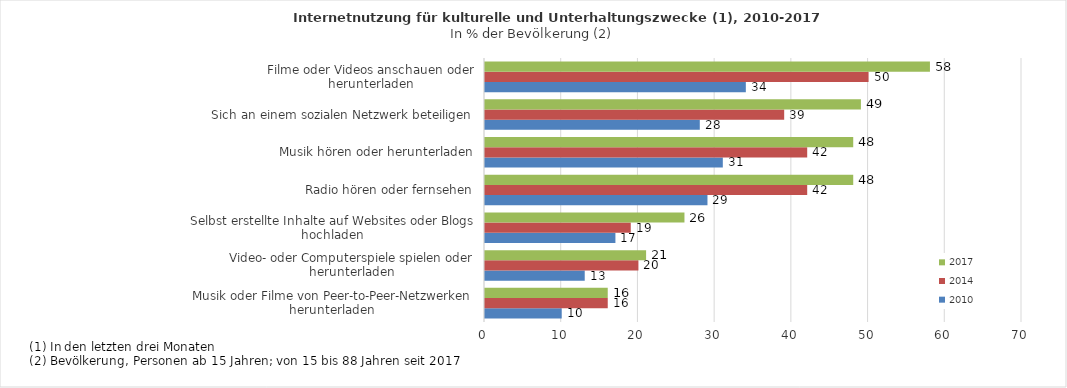
| Category | 2010 | 2014 | 2017 |
|---|---|---|---|
| Musik oder Filme von Peer-to-Peer-Netzwerken herunterladen  | 10 | 16 | 16 |
| Video- oder Computerspiele spielen oder herunterladen | 13 | 20 | 21 |
| Selbst erstellte Inhalte auf Websites oder Blogs hochladen | 17 | 19 | 26 |
| Radio hören oder fernsehen | 29 | 42 | 48 |
| Musik hören oder herunterladen | 31 | 42 | 48 |
| Sich an einem sozialen Netzwerk beteiligen | 28 | 39 | 49 |
| Filme oder Videos anschauen oder herunterladen | 34 | 50 | 58 |